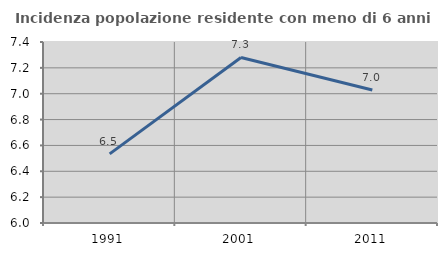
| Category | Incidenza popolazione residente con meno di 6 anni |
|---|---|
| 1991.0 | 6.535 |
| 2001.0 | 7.28 |
| 2011.0 | 7.029 |